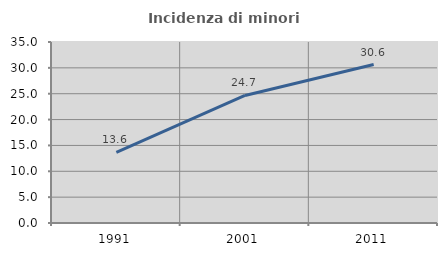
| Category | Incidenza di minori stranieri |
|---|---|
| 1991.0 | 13.636 |
| 2001.0 | 24.658 |
| 2011.0 | 30.647 |